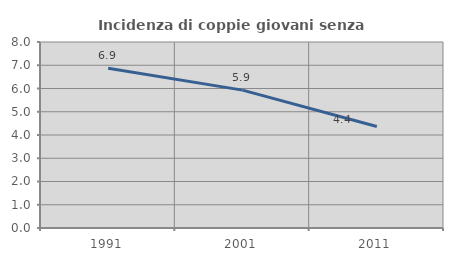
| Category | Incidenza di coppie giovani senza figli |
|---|---|
| 1991.0 | 6.871 |
| 2001.0 | 5.931 |
| 2011.0 | 4.369 |